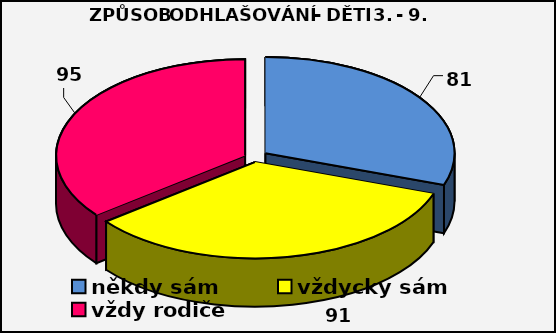
| Category | Series 0 |
|---|---|
| někdy sám | 81 |
| vždycky sám | 91 |
| vždy rodiče | 95 |